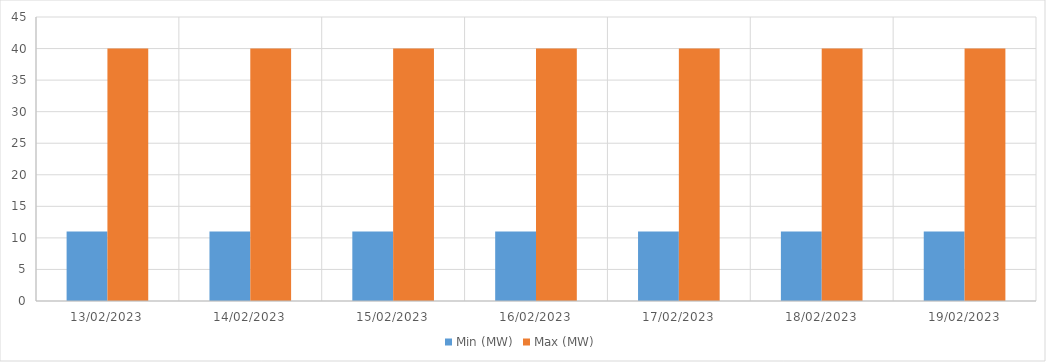
| Category | Min (MW) | Max (MW) |
|---|---|---|
| 13/02/2023 | 11 | 40 |
| 14/02/2023 | 11 | 40 |
| 15/02/2023 | 11 | 40 |
| 16/02/2023 | 11 | 40 |
| 17/02/2023 | 11 | 40 |
| 18/02/2023 | 11 | 40 |
| 19/02/2023 | 11 | 40 |